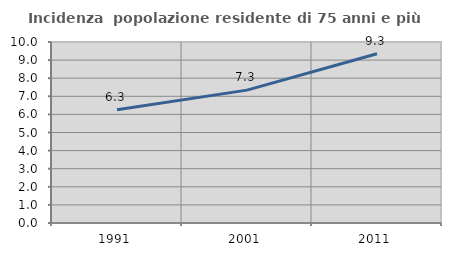
| Category | Incidenza  popolazione residente di 75 anni e più |
|---|---|
| 1991.0 | 6.257 |
| 2001.0 | 7.342 |
| 2011.0 | 9.349 |